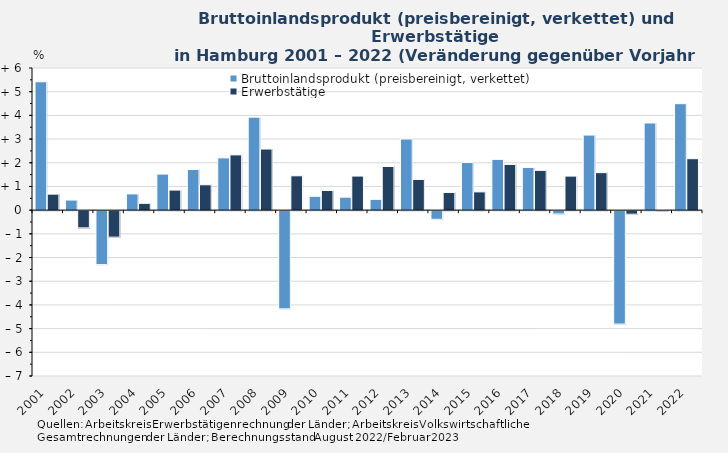
| Category | Bruttoinlandsprodukt (preisbereinigt, verkettet) | Erwerbstätige |
|---|---|---|
| 2001.0 | 5.419 | 0.677 |
| 2002.0 | 0.427 | -0.727 |
| 2003.0 | -2.278 | -1.119 |
| 2004.0 | 0.685 | 0.289 |
| 2005.0 | 1.523 | 0.848 |
| 2006.0 | 1.715 | 1.071 |
| 2007.0 | 2.206 | 2.333 |
| 2008.0 | 3.926 | 2.58 |
| 2009.0 | -4.144 | 1.45 |
| 2010.0 | 0.584 | 0.83 |
| 2011.0 | 0.548 | 1.439 |
| 2012.0 | 0.455 | 1.843 |
| 2013.0 | 3.002 | 1.296 |
| 2014.0 | -0.365 | 0.747 |
| 2015.0 | 2.01 | 0.772 |
| 2016.0 | 2.143 | 1.931 |
| 2017.0 | 1.803 | 1.68 |
| 2018.0 | -0.139 | 1.438 |
| 2019.0 | 3.169 | 1.583 |
| 2020.0 | -4.786 | -0.15 |
| 2021.0 | 3.678 | -0.013 |
| 2022.0 | 4.494 | 2.172 |